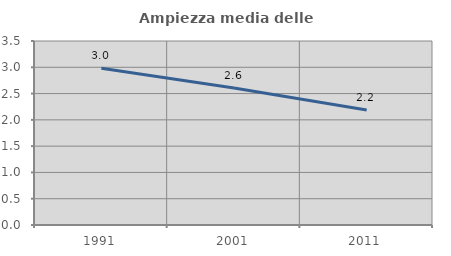
| Category | Ampiezza media delle famiglie |
|---|---|
| 1991.0 | 2.981 |
| 2001.0 | 2.608 |
| 2011.0 | 2.186 |